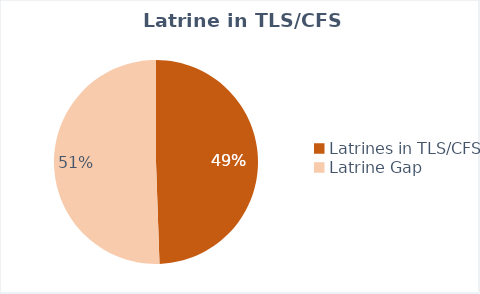
| Category | Series 0 |
|---|---|
| Latrines in TLS/CFS | 229 |
| Latrine Gap | 234.08 |